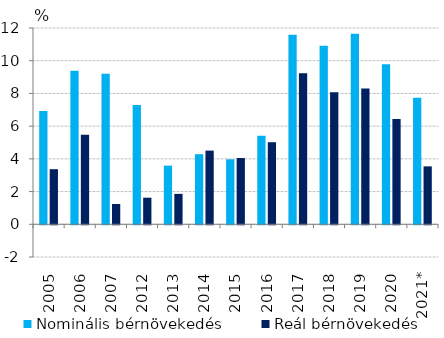
| Category | Nominális bérnövekedés | Reál bérnövekedés |
|---|---|---|
| 2005 | 6.928 | 3.369 |
| 2006 | 9.392 | 5.472 |
| 2007 | 9.205 | 1.239 |
| 2012 | 7.295 | 1.625 |
| 2013 | 3.587 | 1.859 |
| 2014 | 4.285 | 4.504 |
| 2015 | 3.974 | 4.05 |
| 2016 | 5.413 | 5.017 |
| 2017 | 11.58 | 9.229 |
| 2018 | 10.913 | 8.079 |
| 2019 | 11.649 | 8.301 |
| 2020 | 9.778 | 6.443 |
| 2021* | 7.737 | 3.54 |